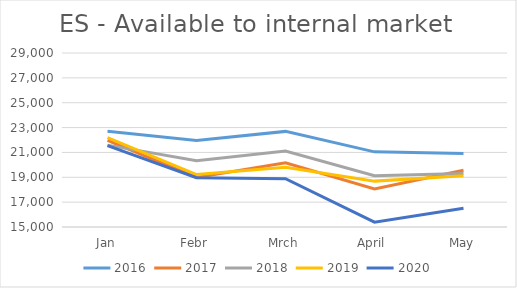
| Category | 2016 | 2017 | 2018 | 2019 | 2020 |
|---|---|---|---|---|---|
| Jan | 22713 | 21976.28 | 21586.829 | 22190.762 | 21548.198 |
| Febr | 21958 | 18986.816 | 20329.251 | 19217.932 | 18969.584 |
| Mrch | 22693 | 20158.962 | 21107.78 | 19807.963 | 18880.408 |
| April | 21045 | 18065.551 | 19123.204 | 18691.533 | 15387.419 |
| May | 20914 | 19570.857 | 19307.485 | 19130.605 | 16504.285 |